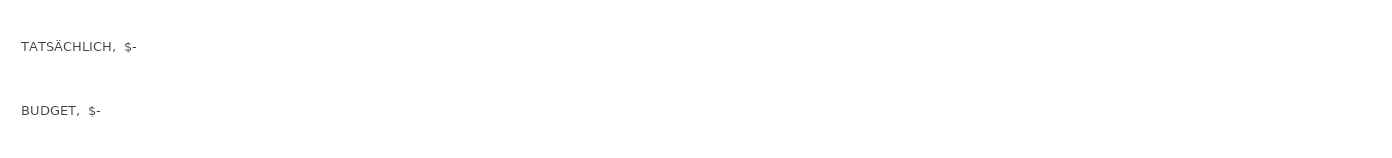
| Category | Series 0 |
|---|---|
| BUDGET | 0 |
| TATSÄCHLICH | 0 |